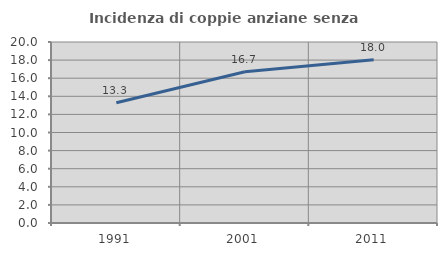
| Category | Incidenza di coppie anziane senza figli  |
|---|---|
| 1991.0 | 13.281 |
| 2001.0 | 16.705 |
| 2011.0 | 18.05 |